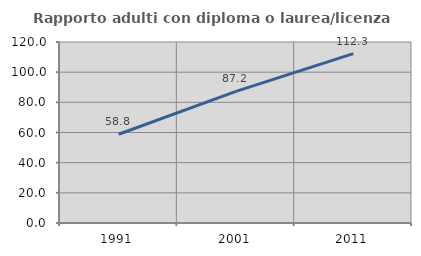
| Category | Rapporto adulti con diploma o laurea/licenza media  |
|---|---|
| 1991.0 | 58.824 |
| 2001.0 | 87.243 |
| 2011.0 | 112.252 |